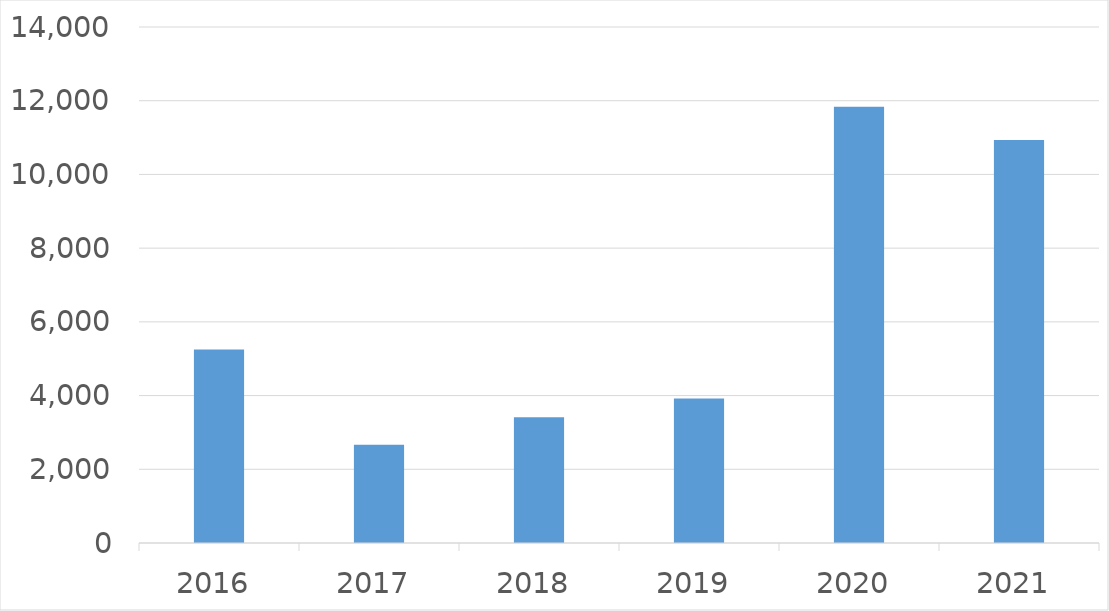
| Category | Series 0 |
|---|---|
| 2016 | 5249 |
| 2017 | 2664 |
| 2018 | 3410 |
| 2019 | 3923 |
| 2020 | 11835 |
| 2021 | 10937 |